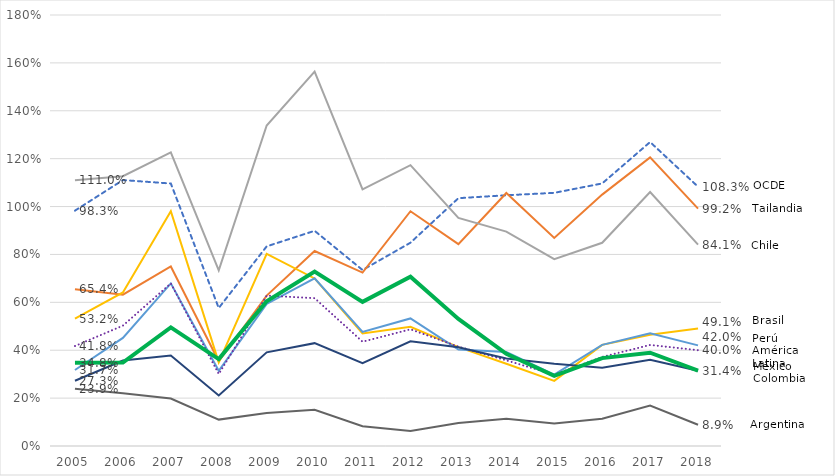
| Category | OCDE | Tailandia | Chile | Brasil | Perú | América Latina | México | Colombia | Argentina |
|---|---|---|---|---|---|---|---|---|---|
| 2005.0 | 0.983 | 0.654 | 1.11 | 0.532 | 0.317 | 0.418 | 0.273 | 0.348 | 0.239 |
| 2006.0 | 1.111 | 0.632 | 1.127 | 0.641 | 0.451 | 0.503 | 0.357 | 0.349 | 0.22 |
| 2007.0 | 1.096 | 0.75 | 1.226 | 0.98 | 0.679 | 0.679 | 0.378 | 0.496 | 0.198 |
| 2008.0 | 0.576 | 0.354 | 0.734 | 0.349 | 0.314 | 0.301 | 0.211 | 0.363 | 0.11 |
| 2009.0 | 0.834 | 0.628 | 1.338 | 0.802 | 0.593 | 0.628 | 0.391 | 0.604 | 0.137 |
| 2010.0 | 0.899 | 0.814 | 1.564 | 0.7 | 0.701 | 0.617 | 0.43 | 0.729 | 0.151 |
| 2011.0 | 0.735 | 0.724 | 1.072 | 0.47 | 0.477 | 0.435 | 0.346 | 0.602 | 0.082 |
| 2012.0 | 0.849 | 0.98 | 1.173 | 0.498 | 0.533 | 0.487 | 0.437 | 0.707 | 0.063 |
| 2013.0 | 1.035 | 0.843 | 0.952 | 0.413 | 0.403 | 0.415 | 0.413 | 0.531 | 0.096 |
| 2014.0 | 1.047 | 1.057 | 0.895 | 0.344 | 0.392 | 0.358 | 0.365 | 0.385 | 0.114 |
| 2015.0 | 1.057 | 0.869 | 0.78 | 0.272 | 0.298 | 0.298 | 0.344 | 0.293 | 0.094 |
| 2016.0 | 1.097 | 1.05 | 0.849 | 0.422 | 0.423 | 0.372 | 0.327 | 0.367 | 0.114 |
| 2017.0 | 1.269 | 1.205 | 1.061 | 0.465 | 0.471 | 0.422 | 0.36 | 0.39 | 0.169 |
| 2018.0 | 1.083 | 0.992 | 0.841 | 0.491 | 0.42 | 0.4 | 0.315 | 0.314 | 0.089 |